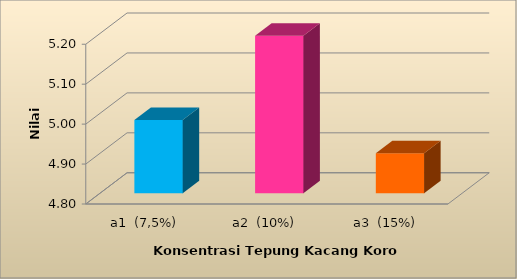
| Category | Nilai rata-rata |
|---|---|
| a1  (7,5%) | 4.983 |
| a2  (10%) | 5.194 |
| a3  (15%) | 4.9 |